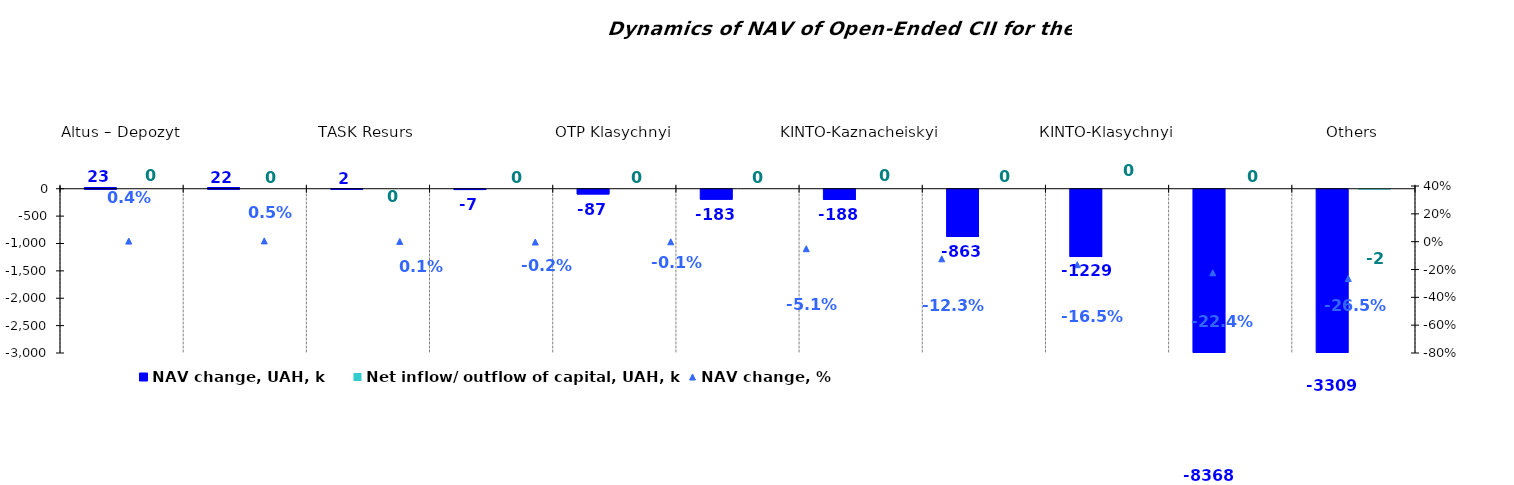
| Category | NAV change, UAH, k | Net inflow/ outflow of capital, UAH, k |
|---|---|---|
| Altus – Depozyt | 22.741 | 0 |
| Altus – Zbalansovanyi | 22.473 | 0 |
| ТАSK Resurs | 1.544 | 0 |
| VSI | -6.54 | 0 |
| ОТP Klasychnyi | -87.001 | 0 |
| UNIVER.UA/Taras Shevchenko: Fond Zaoshchadzhen | -182.705 | 0 |
| KINTO-Kaznacheiskyi | -187.569 | 0 |
| UNIVER.UA/Мykhailo Hrushevskyi: Fond Derzhavnykh Paperiv | -863.127 | 0 |
| КINТО-Кlasychnyi | -1229.495 | 0 |
| КІNTO-Ekviti | -8367.984 | 0 |
| Others | -3309.31 | -2.047 |